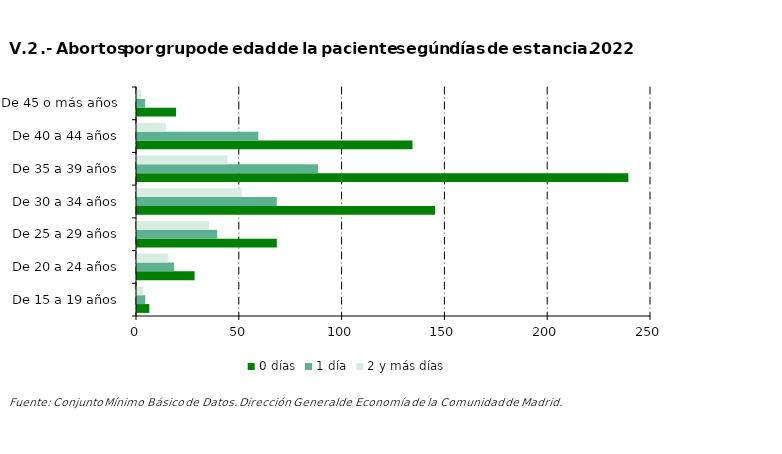
| Category | 0 días | 1 día | 2 y más días |
|---|---|---|---|
| De 15 a 19 años | 6 | 4 | 3 |
| De 20 a 24 años | 28 | 18 | 15 |
| De 25 a 29 años | 68 | 39 | 35 |
| De 30 a 34 años | 145 | 68 | 51 |
| De 35 a 39 años | 239 | 88 | 44 |
| De 40 a 44 años | 134 | 59 | 14 |
| De 45 o más años | 19 | 4 | 2 |